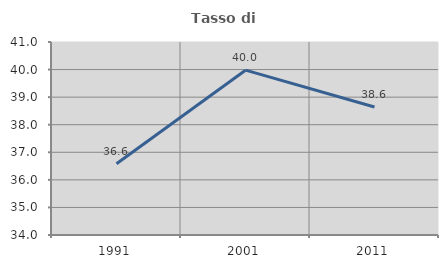
| Category | Tasso di occupazione   |
|---|---|
| 1991.0 | 36.583 |
| 2001.0 | 39.978 |
| 2011.0 | 38.642 |